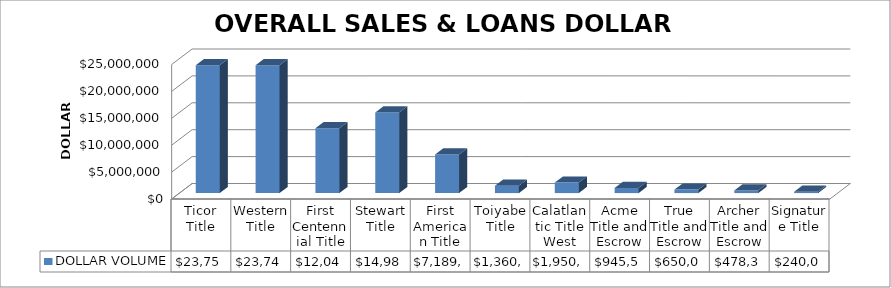
| Category | DOLLAR VOLUME |
|---|---|
| Ticor Title | 23750982 |
| Western Title | 23748886 |
| First Centennial Title | 12047487 |
| Stewart Title | 14984010 |
| First American Title | 7189550 |
| Toiyabe Title | 1360000 |
| Calatlantic Title West | 1950783 |
| Acme Title and Escrow | 945500 |
| True Title and Escrow | 650050 |
| Archer Title and Escrow | 478390 |
| Signature Title | 240000 |